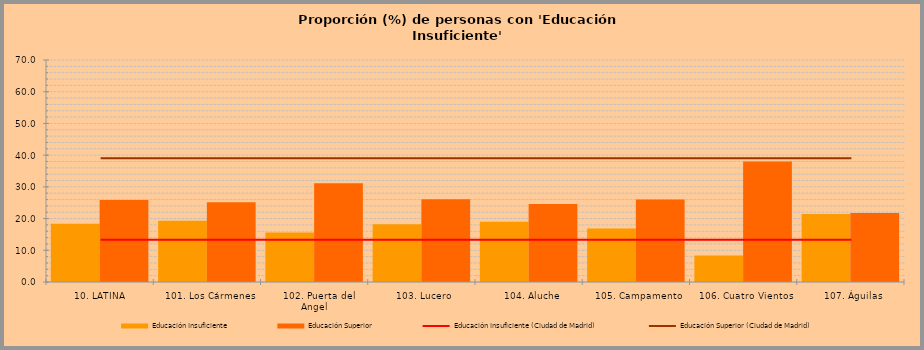
| Category | Educación Insuficiente | Educación Superior |
|---|---|---|
|  10. LATINA | 18.399 | 25.85 |
|    101. Los Cármenes | 19.342 | 25.161 |
|    102. Puerta del Angel | 15.588 | 31.131 |
|    103. Lucero | 18.202 | 26.106 |
|    104. Aluche | 18.997 | 24.576 |
|    105. Campamento | 16.89 | 26.027 |
|    106. Cuatro Vientos | 8.355 | 38 |
|    107. Águilas | 21.449 | 21.748 |